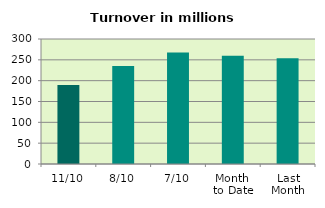
| Category | Series 0 |
|---|---|
| 11/10 | 189.628 |
| 8/10 | 235.164 |
| 7/10 | 267.353 |
| Month 
to Date | 259.702 |
| Last
Month | 253.961 |